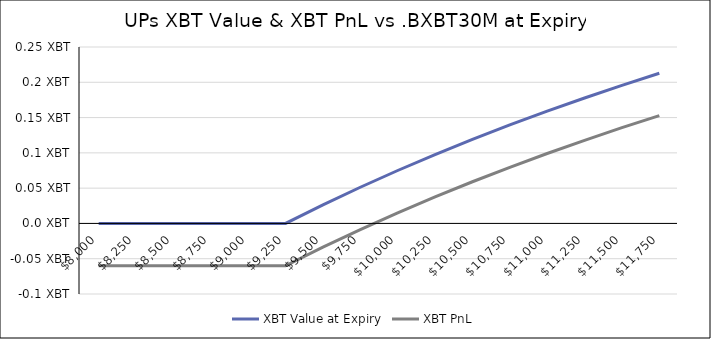
| Category | XBT Value at Expiry | XBT PnL |
|---|---|---|
| 8000.0 | 0 | -0.06 |
| 8250.0 | 0 | -0.06 |
| 8500.0 | 0 | -0.06 |
| 8750.0 | 0 | -0.06 |
| 9000.0 | 0 | -0.06 |
| 9250.0 | 0 | -0.06 |
| 9500.0 | 0.026 | -0.034 |
| 9750.0 | 0.051 | -0.009 |
| 10000.0 | 0.075 | 0.015 |
| 10250.0 | 0.098 | 0.038 |
| 10500.0 | 0.119 | 0.059 |
| 10750.0 | 0.14 | 0.08 |
| 11000.0 | 0.159 | 0.099 |
| 11250.0 | 0.178 | 0.118 |
| 11500.0 | 0.196 | 0.136 |
| 11750.0 | 0.213 | 0.153 |